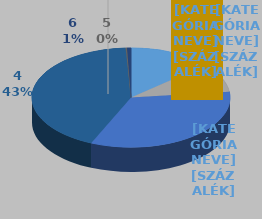
| Category | Series 0 |
|---|---|
| 0 | 85000 |
| 1 | 60000 |
| 2 | 210000 |
| 3 | 267000 |
| 4 | 1500 |
| 5 | 4000 |